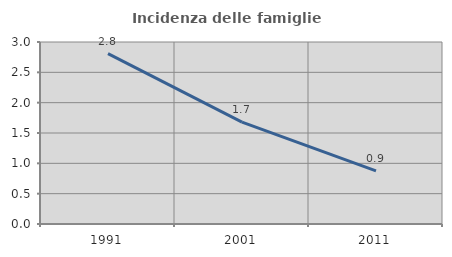
| Category | Incidenza delle famiglie numerose |
|---|---|
| 1991.0 | 2.809 |
| 2001.0 | 1.679 |
| 2011.0 | 0.876 |